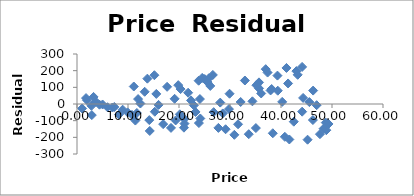
| Category | Series 0 |
|---|---|
| 1.0 | -26.822 |
| 1.7721277707126588 | 35.536 |
| 1.9585093962766742 | 22.689 |
| 2.8313064988848318 | -10.774 |
| 2.9027415075817804 | -66.603 |
| 3.2467590622821634 | 42.516 |
| 3.715613060032769 | 13.306 |
| 4.414745251841259 | -4.194 |
| 5.014150714508328 | -2.919 |
| 5.980190490363254 | -19.485 |
| 6.929938560319105 | -21.131 |
| 7.318303283917859 | -17.834 |
| 8.230176090835677 | -63.297 |
| 8.953284496885392 | -34.105 |
| 9.93135475690074 | -50.303 |
| 10.77988163045602 | -65.529 |
| 11.132024017224099 | 104.986 |
| 11.444996358568313 | -99.298 |
| 11.734721377834083 | -54.05 |
| 11.974336770351202 | 29.62 |
| 12.430509982365422 | 2.827 |
| 13.271342097442291 | 73.389 |
| 13.798327160439607 | 152.029 |
| 14.175422173075109 | -96.508 |
| 14.266122671433783 | -161.782 |
| 15.17207143975984 | 172.742 |
| 15.257181445256426 | -46.358 |
| 15.551763010002563 | 60.406 |
| 15.993707190730474 | -5.257 |
| 16.89582713176302 | -120.864 |
| 17.666315599654947 | 103.102 |
| 18.428895358195945 | -143.401 |
| 19.143173688158008 | 31.15 |
| 19.347071805664836 | -98.709 |
| 19.85175039286341 | 113.064 |
| 20.161901068949092 | -61.923 |
| 20.310137608698632 | 89.59 |
| 20.970563700874596 | -142.091 |
| 21.029285700074063 | -90.002 |
| 21.075669627206246 | -117.488 |
| 21.792897848781617 | 67.515 |
| 22.36166243737641 | 21.503 |
| 22.91376866209962 | -7.994 |
| 23.242318180036882 | -47.759 |
| 23.85465904271913 | 139.754 |
| 23.90324614378775 | -114.3 |
| 24.103996666662397 | 29.802 |
| 24.17780104567195 | -86.852 |
| 24.552404243290617 | 156.651 |
| 25.042521134504366 | 149.705 |
| 25.59091129088352 | 131.379 |
| 25.852239902993784 | 154.459 |
| 26.13632424601183 | 108.294 |
| 26.633505446200036 | 174.282 |
| 26.799239564593535 | -48.963 |
| 27.72100595651242 | -143.309 |
| 28.086209797806212 | 8.409 |
| 28.58346742046228 | -56.545 |
| 29.13523869315873 | -151.488 |
| 29.796085279339973 | -30.48 |
| 29.91371295084885 | 61.637 |
| 30.854100645917526 | -184.928 |
| 31.575700601830953 | -121.607 |
| 32.08975863740304 | 12.04 |
| 32.9218838065499 | 140.934 |
| 33.68071644831483 | -181.203 |
| 34.39587243990781 | 16.089 |
| 35.07512698745129 | -144.321 |
| 35.175888897001705 | 112.594 |
| 35.68523523755617 | 129.778 |
| 35.696449406769354 | 93.743 |
| 36.12051395611863 | 63.192 |
| 37.00131746195319 | 208.996 |
| 37.37125790555555 | 188.641 |
| 37.952296038601695 | 81.282 |
| 38.16727649800819 | 89.941 |
| 38.38898186264048 | -175.506 |
| 39.30199857954961 | 170.413 |
| 39.36805231327567 | 79.745 |
| 40.23305502824163 | 12.768 |
| 40.747618388267064 | -196.857 |
| 41.074359924101444 | 216.19 |
| 41.38828071876815 | 123.235 |
| 41.634994234719784 | -212.84 |
| 42.50839470024612 | -106.175 |
| 43.01493230229939 | 197.333 |
| 43.27231064078972 | 175.161 |
| 44.139965872345485 | 222.544 |
| 44.147630171453415 | -46.02 |
| 44.3361979836301 | 36.399 |
| 45.206436210408086 | -214.203 |
| 45.56132472658592 | 11.323 |
| 46.25663536286757 | -96.241 |
| 46.303721712112306 | 80.52 |
| 46.98862397483953 | -7.11 |
| 47.63422906661138 | -181.12 |
| 48.35007689117924 | -147.805 |
| 48.77760881966801 | -111.693 |
| 48.883386525271185 | -157.277 |
| 49.314056764968704 | -119.873 |